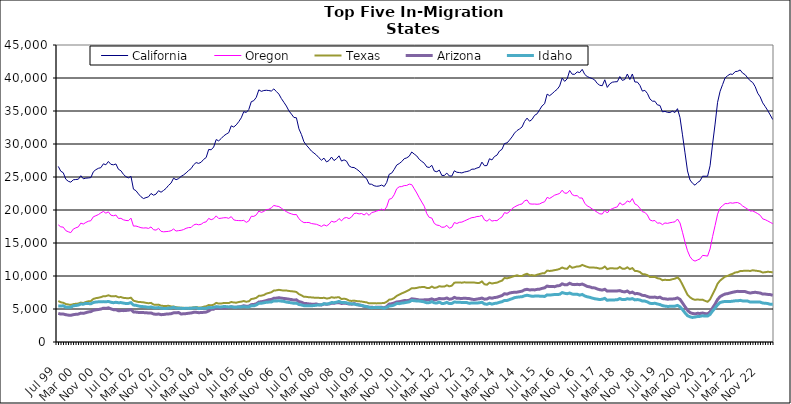
| Category | California | Oregon | Texas | Arizona | Idaho |
|---|---|---|---|---|---|
| Jul 99 | 26605 | 17749 | 6209 | 4339 | 5471 |
| Aug 99 | 25882 | 17447 | 6022 | 4228 | 5444 |
| Sep 99 | 25644 | 17401 | 5941 | 4237 | 5488 |
| Oct 99 | 24669 | 16875 | 5751 | 4134 | 5279 |
| Nov 99 | 24353 | 16701 | 5680 | 4073 | 5260 |
| Dec 99 | 24218 | 16570 | 5619 | 4042 | 5269 |
| Jan 00 | 24574 | 17109 | 5736 | 4142 | 5485 |
| Feb 00 | 24620 | 17295 | 5789 | 4192 | 5530 |
| Mar 00 | 24655 | 17436 | 5826 | 4226 | 5590 |
| Apr 00 | 25195 | 18009 | 5980 | 4375 | 5748 |
| May 00 | 24730 | 17875 | 5897 | 4337 | 5729 |
| Jun 00 | 24825 | 18113 | 6070 | 4444 | 5853 |
| Jul 00 | 24857 | 18294 | 6163 | 4555 | 5824 |
| Aug 00 | 24913 | 18376 | 6199 | 4603 | 5788 |
| Sep 00 | 25792 | 18971 | 6529 | 4804 | 5976 |
| Oct 00 | 26106 | 19135 | 6643 | 4870 | 6058 |
| Nov 00 | 26315 | 19306 | 6705 | 4926 | 6085 |
| Dec 00 | 26415 | 19570 | 6793 | 4991 | 6096 |
| Jan 01 | 26995 | 19781 | 6942 | 5122 | 6119 |
| Feb 01 | 26851 | 19519 | 6948 | 5089 | 6090 |
| Mar 01 | 27352 | 19720 | 7080 | 5180 | 6143 |
| Apr 01 | 26918 | 19221 | 6943 | 5020 | 6020 |
| May 01 | 26848 | 19126 | 6924 | 4899 | 5950 |
| Jun 01 | 26974 | 19241 | 6959 | 4895 | 6019 |
| Jul 01 | 26172 | 18725 | 6778 | 4737 | 5951 |
| Aug 01 | 25943 | 18736 | 6810 | 4757 | 5973 |
| Sep 01 | 25399 | 18514 | 6688 | 4753 | 5895 |
| Oct 01 | 25050 | 18415 | 6650 | 4780 | 5833 |
| Nov 01 | 24873 | 18381 | 6631 | 4826 | 5850 |
| Dec 01 | 25099 | 18765 | 6708 | 4898 | 5969 |
| Jan 02 | 23158 | 17561 | 6261 | 4560 | 5595 |
| Feb 02 | 22926 | 17573 | 6162 | 4531 | 5560 |
| Mar 02 | 22433 | 17452 | 6052 | 4481 | 5458 |
| Apr 02 | 22012 | 17314 | 6046 | 4458 | 5380 |
| May 02 | 21733 | 17267 | 6007 | 4452 | 5358 |
| Jun 02 | 21876 | 17298 | 5933 | 4444 | 5315 |
| Jul 02 | 21997 | 17209 | 5873 | 4383 | 5243 |
| Aug 02 | 22507 | 17436 | 5929 | 4407 | 5315 |
| Sep 02 | 22244 | 17010 | 5672 | 4248 | 5192 |
| Oct 02 | 22406 | 16952 | 5625 | 4191 | 5167 |
| Nov 02 | 22922 | 17223 | 5663 | 4242 | 5221 |
| Dec 02 | 22693 | 16770 | 5499 | 4142 | 5120 |
| Jan 03 | 22964 | 16694 | 5463 | 4166 | 5089 |
| Feb 03 | 23276 | 16727 | 5461 | 4226 | 5077 |
| Mar 03 | 23736 | 16766 | 5486 | 4251 | 5145 |
| Apr 03 | 24079 | 16859 | 5389 | 4289 | 5145 |
| May 03 | 24821 | 17117 | 5378 | 4415 | 5254 |
| Jun 03 | 24592 | 16812 | 5273 | 4426 | 5135 |
| Jul 03 | 24754 | 16875 | 5226 | 4466 | 5124 |
| Aug 03 | 25092 | 16922 | 5181 | 4244 | 5100 |
| Sep 03 | 25316 | 17036 | 5181 | 4279 | 5086 |
| Oct 03 | 25622 | 17228 | 5139 | 4301 | 5110 |
| Nov 03 | 25984 | 17335 | 5175 | 4362 | 5091 |
| Dec 03 | 26269 | 17350 | 5189 | 4396 | 5113 |
| Jan 04 | 26852 | 17734 | 5255 | 4492 | 5152 |
| Feb 04 | 27184 | 17860 | 5301 | 4502 | 5183 |
| Mar 04 | 27062 | 17757 | 5227 | 4443 | 5056 |
| Apr 04 | 27238 | 17840 | 5227 | 4461 | 5104 |
| May 04 | 27671 | 18113 | 5345 | 4493 | 5095 |
| Jun 04 | 27949 | 18201 | 5416 | 4532 | 5103 |
| Jul 04 | 29172 | 18727 | 5597 | 4697 | 5231 |
| Aug 04 | 29122 | 18529 | 5561 | 4945 | 5197 |
| Sep 04 | 29542 | 18678 | 5656 | 4976 | 5237 |
| Oct 04 | 30674 | 19108 | 5922 | 5188 | 5363 |
| Nov 04 | 30472 | 18716 | 5823 | 5106 | 5321 |
| Dec 04 | 30831 | 18755 | 5838 | 5135 | 5312 |
| Jan 05 | 31224 | 18823 | 5906 | 5155 | 5374 |
| Feb 05 | 31495 | 18842 | 5898 | 5168 | 5357 |
| Mar 05 | 31714 | 18738 | 5894 | 5212 | 5313 |
| Apr 05 | 32750 | 18998 | 6060 | 5340 | 5350 |
| May 05 | 32575 | 18504 | 5989 | 5269 | 5276 |
| Jun 05 | 32898 | 18414 | 5954 | 5252 | 5271 |
| Jul 05 | 33384 | 18395 | 6062 | 5322 | 5322 |
| Aug 05 | 33964 | 18381 | 6113 | 5375 | 5316 |
| Sep 05 | 34897 | 18426 | 6206 | 5493 | 5362 |
| Oct 05 | 34780 | 18132 | 6100 | 5408 | 5308 |
| Nov 05 | 35223 | 18332 | 6162 | 5434 | 5314 |
| Dec 05 | 36415 | 19047 | 6508 | 5658 | 5487 |
| Jan 06 | 36567 | 19032 | 6576 | 5688 | 5480 |
| Feb 06 | 37074 | 19257 | 6692 | 5792 | 5616 |
| Mar 06 | 38207 | 19845 | 6993 | 6052 | 5850 |
| Apr 06 | 37976 | 19637 | 7024 | 6101 | 5864 |
| May 06 | 38099 | 19781 | 7114 | 6178 | 5943 |
| Jun 06 | 38141 | 20061 | 7331 | 6276 | 6018 |
| Jul 06 | 38097 | 20111 | 7431 | 6399 | 6046 |
| Aug 06 | 38021 | 20333 | 7542 | 6450 | 6064 |
| Sep 06 | 38349 | 20686 | 7798 | 6627 | 6232 |
| Oct 06 | 37947 | 20591 | 7825 | 6647 | 6216 |
| Nov 06 | 37565 | 20526 | 7907 | 6707 | 6244 |
| Dec 06 | 36884 | 20272 | 7840 | 6648 | 6192 |
| Jan 07 | 36321 | 19984 | 7789 | 6597 | 6151 |
| Feb 07 | 35752 | 19752 | 7799 | 6554 | 6048 |
| Mar 07 | 35025 | 19547 | 7737 | 6487 | 5989 |
| Apr 07 | 34534 | 19412 | 7685 | 6430 | 5937 |
| May 07 | 34022 | 19296 | 7654 | 6353 | 5858 |
| Jun 07 | 33974 | 19318 | 7577 | 6390 | 5886 |
| Jul 07 | 32298 | 18677 | 7250 | 6117 | 5682 |
| Aug 07 | 31436 | 18322 | 7070 | 6034 | 5617 |
| Sep 07 | 30331 | 18087 | 6853 | 5847 | 5500 |
| Oct 07 | 29813 | 18108 | 6839 | 5821 | 5489 |
| Nov 07 | 29384 | 18105 | 6777 | 5769 | 5481 |
| Dec 07 | 28923 | 17949 | 6760 | 5733 | 5499 |
| Jan 08 | 28627 | 17890 | 6721 | 5732 | 5521 |
| Feb 08 | 28328 | 17834 | 6719 | 5749 | 5579 |
| Mar 08 | 27911 | 17680 | 6690 | 5650 | 5614 |
| Apr 08 | 27543 | 17512 | 6656 | 5612 | 5635 |
| May 08 | 27856 | 17754 | 6705 | 5774 | 5798 |
| Jun 08 | 27287 | 17589 | 6593 | 5717 | 5745 |
| Jul 08 | 27495 | 17834 | 6623 | 5761 | 5807 |
| Aug 08 | 28018 | 18309 | 6789 | 5867 | 5982 |
| Sep-08 | 27491 | 18164 | 6708 | 5864 | 5954 |
| Oct 08 | 27771 | 18291 | 6755 | 5942 | 6032 |
| Nov 08 | 28206 | 18706 | 6787 | 5970 | 6150 |
| Dec 08 | 27408 | 18353 | 6505 | 5832 | 5975 |
| Jan 09 | 27601 | 18778 | 6569 | 5890 | 5995 |
| Feb 09 | 27394 | 18863 | 6483 | 5845 | 5936 |
| Mar 09 | 26690 | 18694 | 6273 | 5751 | 5806 |
| Apr 09 | 26461 | 18943 | 6222 | 5735 | 5777 |
| May 09 | 26435 | 19470 | 6272 | 5819 | 5767 |
| Jun 09 | 26187 | 19522 | 6199 | 5700 | 5649 |
| Jul 09 | 25906 | 19408 | 6171 | 5603 | 5617 |
| Aug 09 | 25525 | 19469 | 6128 | 5533 | 5540 |
| Sep 09 | 25050 | 19249 | 6059 | 5405 | 5437 |
| Oct 09 | 24741 | 19529 | 6004 | 5349 | 5369 |
| Nov 09 | 23928 | 19187 | 5854 | 5271 | 5248 |
| Dec 09 | 23899 | 19607 | 5886 | 5261 | 5195 |
| Jan 10 | 23676 | 19703 | 5881 | 5232 | 5234 |
| Feb 10 | 23592 | 19845 | 5850 | 5272 | 5236 |
| Mar 10 | 23634 | 19946 | 5864 | 5278 | 5219 |
| Apr 10 | 23774 | 20134 | 5889 | 5257 | 5201 |
| May 10 | 23567 | 19966 | 5897 | 5172 | 5105 |
| Jun 10 | 24166 | 20464 | 6087 | 5356 | 5237 |
| Jul 10 | 25410 | 21627 | 6417 | 5742 | 5452 |
| Aug 10 | 25586 | 21744 | 6465 | 5797 | 5491 |
| Sep 10 | 26150 | 22314 | 6667 | 5907 | 5609 |
| Oct 10 | 26807 | 23219 | 6986 | 6070 | 5831 |
| Nov 10 | 27033 | 23520 | 7179 | 6100 | 5810 |
| Dec 10 | 27332 | 23551 | 7361 | 6182 | 5898 |
| Jan 11 | 27769 | 23697 | 7525 | 6276 | 5938 |
| Feb 11 | 27898 | 23718 | 7708 | 6267 | 6016 |
| Mar 11 | 28155 | 23921 | 7890 | 6330 | 6081 |
| Apr 11 | 28790 | 23847 | 8146 | 6544 | 6305 |
| May 11 | 28471 | 23215 | 8131 | 6502 | 6248 |
| Jun 11 | 28191 | 22580 | 8199 | 6445 | 6217 |
| Jul 11 | 27678 | 21867 | 8291 | 6368 | 6202 |
| Aug 11 | 27372 | 21203 | 8321 | 6356 | 6146 |
| Sep 11 | 27082 | 20570 | 8341 | 6387 | 6075 |
| Oct 11 | 26528 | 19442 | 8191 | 6402 | 5932 |
| Nov 11 | 26440 | 18872 | 8176 | 6426 | 5968 |
| Dec 11 | 26770 | 18784 | 8401 | 6533 | 6106 |
| Jan 12 | 25901 | 17963 | 8202 | 6390 | 5933 |
| Feb 12 | 25796 | 17718 | 8266 | 6456 | 5900 |
| Mar 12 | 26042 | 17647 | 8456 | 6600 | 6054 |
| Apr 12 | 25239 | 17386 | 8388 | 6534 | 5838 |
| May 12 | 25238 | 17407 | 8401 | 6558 | 5854 |
| Jun 12 | 25593 | 17673 | 8594 | 6669 | 6009 |
| Jul 12 | 25155 | 17237 | 8432 | 6474 | 5817 |
| Aug 12 | 25146 | 17391 | 8536 | 6539 | 5842 |
| Sep 12 | 25942 | 18102 | 8989 | 6759 | 6061 |
| Oct 12 | 25718 | 17953 | 9012 | 6618 | 6027 |
| Nov 12 | 25677 | 18134 | 9032 | 6611 | 6009 |
| Dec 12 | 25619 | 18166 | 8981 | 6601 | 5999 |
| Jan 13 | 25757 | 18344 | 9051 | 6627 | 5989 |
| Feb-13 | 25830 | 18512 | 9001 | 6606 | 5968 |
| Mar-13 | 25940 | 18689 | 9021 | 6577 | 5853 |
| Apr 13 | 26187 | 18844 | 9013 | 6478 | 5925 |
| May 13 | 26192 | 18884 | 9003 | 6431 | 5924 |
| Jun-13 | 26362 | 19013 | 8948 | 6508 | 5896 |
| Jul 13 | 26467 | 19037 | 8958 | 6559 | 5948 |
| Aug 13 | 27253 | 19198 | 9174 | 6655 | 6020 |
| Sep 13 | 26711 | 18501 | 8747 | 6489 | 5775 |
| Oct 13 | 26733 | 18301 | 8681 | 6511 | 5711 |
| Nov 13 | 27767 | 18620 | 8989 | 6709 | 5860 |
| Dec 13 | 27583 | 18320 | 8863 | 6637 | 5740 |
| Jan 14 | 28107 | 18409 | 8939 | 6735 | 5843 |
| Feb-14 | 28313 | 18383 | 8989 | 6779 | 5893 |
| Mar 14 | 28934 | 18696 | 9160 | 6918 | 6015 |
| Apr 14 | 29192 | 18946 | 9291 | 7036 | 6099 |
| May 14 | 30069 | 19603 | 9701 | 7314 | 6304 |
| Jun 14 | 30163 | 19487 | 9641 | 7252 | 6293 |
| Jul-14 | 30587 | 19754 | 9752 | 7415 | 6427 |
| Aug-14 | 31074 | 20201 | 9882 | 7499 | 6557 |
| Sep 14 | 31656 | 20459 | 9997 | 7536 | 6719 |
| Oct 14 | 32037 | 20663 | 10109 | 7555 | 6786 |
| Nov 14 | 32278 | 20825 | 9992 | 7628 | 6831 |
| Dec 14 | 32578 | 20918 | 10006 | 7705 | 6860 |
| Jan 15 | 33414 | 21396 | 10213 | 7906 | 7000 |
| Feb 15 | 33922 | 21518 | 10337 | 7982 | 7083 |
| Mar 15 | 33447 | 20942 | 10122 | 7891 | 7006 |
| Apr-15 | 33731 | 20893 | 10138 | 7906 | 6931 |
| May 15 | 34343 | 20902 | 10053 | 7895 | 6952 |
| Jun-15 | 34572 | 20870 | 10192 | 7973 | 6966 |
| Jul 15 | 35185 | 20916 | 10303 | 8000 | 6949 |
| Aug 15 | 35780 | 21115 | 10399 | 8126 | 6938 |
| Sep 15 | 36109 | 21246 | 10428 | 8207 | 6896 |
| Oct 15 | 37555 | 21908 | 10813 | 8477 | 7140 |
| Nov 15 | 37319 | 21750 | 10763 | 8390 | 7112 |
| Dec 15 | 37624 | 21990 | 10807 | 8395 | 7149 |
| Jan 16 | 37978 | 22248 | 10892 | 8388 | 7201 |
| Feb 16 | 38285 | 22369 | 10951 | 8508 | 7192 |
| Mar 16 | 38792 | 22506 | 11075 | 8547 | 7226 |
| Apr 16 | 39994 | 22999 | 11286 | 8815 | 7487 |
| May 16 | 39488 | 22548 | 11132 | 8673 | 7382 |
| Jun 16 | 39864 | 22556 | 11100 | 8682 | 7315 |
| Jul 16 | 41123 | 22989 | 11516 | 8903 | 7420 |
| Aug 16 | 40573 | 22333 | 11251 | 8731 | 7261 |
| Sep 16 | 40560 | 22162 | 11340 | 8692 | 7216 |
| Oct 16 | 40923 | 22172 | 11456 | 8742 | 7233 |
| Nov 16 | 40817 | 21818 | 11459 | 8685 | 7101 |
| Dec 16 | 41311 | 21815 | 11681 | 8783 | 7203 |
| Jan 17 | 40543 | 21029 | 11524 | 8609 | 6982 |
| Feb 17 | 40218 | 20613 | 11385 | 8416 | 6852 |
| Mar 17 | 40052 | 20425 | 11276 | 8354 | 6775 |
| Apr 17 | 39913 | 20147 | 11297 | 8218 | 6653 |
| May 17 | 39695 | 19910 | 11265 | 8196 | 6552 |
| Jun 17 | 39177 | 19650 | 11225 | 8034 | 6500 |
| Jul 17 | 38901 | 19419 | 11115 | 7923 | 6429 |
| Aug 17 | 38827 | 19389 | 11168 | 7867 | 6479 |
| Sep 17 | 39736 | 19936 | 11426 | 7991 | 6609 |
| Oct 17 | 38576 | 19547 | 11041 | 7708 | 6315 |
| Nov 17 | 39108 | 20013 | 11158 | 7746 | 6381 |
| Dec 17 | 39359 | 20202 | 11185 | 7743 | 6366 |
| Jan 18 | 39420 | 20362 | 11118 | 7736 | 6380 |
| Feb 18 | 39440 | 20476 | 11128 | 7741 | 6407 |
| Mar 18 | 40218 | 21106 | 11362 | 7789 | 6578 |
| Apr 18 | 39637 | 20788 | 11111 | 7642 | 6423 |
| May 18 | 39777 | 20933 | 11097 | 7591 | 6430 |
| Jun 18 | 40602 | 21381 | 11317 | 7721 | 6554 |
| Jul 18 | 39767 | 21189 | 11038 | 7445 | 6489 |
| Aug 18 | 40608 | 21729 | 11200 | 7560 | 6569 |
| Sep 18 | 39395 | 20916 | 10772 | 7318 | 6383 |
| Oct 18 | 39383 | 20724 | 10740 | 7344 | 6429 |
| Nov 18 | 38891 | 20265 | 10605 | 7255 | 6365 |
| Dec 18 | 38013 | 19741 | 10292 | 7069 | 6205 |
| Jan 19 | 38130 | 19643 | 10261 | 7032 | 6203 |
| Feb 19 | 37658 | 19237 | 10132 | 6892 | 6073 |
| Mar 19 | 36831 | 18492 | 9848 | 6766 | 5863 |
| Apr 19 | 36492 | 18349 | 9839 | 6763 | 5827 |
| May 19 | 36481 | 18407 | 9867 | 6809 | 5873 |
| Jun 19 | 35925 | 17998 | 9661 | 6698 | 5761 |
| Jul 19 | 35843 | 18049 | 9598 | 6800 | 5673 |
| Aug 19 | 34870 | 17785 | 9361 | 6577 | 5512 |
| Sep 19 | 34945 | 18038 | 9428 | 6547 | 5437 |
| Oct 19 | 34802 | 17977 | 9385 | 6483 | 5390 |
| Nov 19 | 34775 | 18072 | 9403 | 6511 | 5401 |
| Dec 19 | 34976 | 18140 | 9518 | 6521 | 5419 |
| Jan 20 | 34774 | 18209 | 9594 | 6561 | 5434 |
| Feb 20 | 35352 | 18632 | 9804 | 6682 | 5543 |
| Mar 20 | 34013 | 18041 | 9411 | 6464 | 5330 |
| Apr 20 | 31385 | 16629 | 8666 | 5922 | 4906 |
| May 20 | 28657 | 15123 | 7927 | 5355 | 4419 |
| Jun 20 | 25915 | 13817 | 7164 | 4815 | 3992 |
| Jul 20 | 24545 | 12926 | 6776 | 4457 | 3810 |
| Aug 20 | 24048 | 12443 | 6521 | 4326 | 3720 |
| Sep 20 | 23756 | 12258 | 6386 | 4266 | 3784 |
| Oct 20 | 24166 | 12429 | 6452 | 4347 | 3861 |
| Nov 20 | 24404 | 12597 | 6386 | 4324 | 3883 |
| Dec 20 | 25120 | 13122 | 6420 | 4394 | 3974 |
| Jan 21 | 25111 | 13080 | 6236 | 4304 | 3924 |
| Feb 21 | 25114 | 13015 | 6094 | 4260 | 3930 |
| Mar 21 | 26701 | 14096 | 6455 | 4567 | 4185 |
| Apr 21 | 29998 | 15978 | 7222 | 5164 | 4697 |
| May 21 | 33020 | 17641 | 7969 | 5748 | 5148 |
| Jun 21 | 36320 | 19369 | 8840 | 6450 | 5628 |
| Jul 21 | 37989 | 20320 | 9306 | 6877 | 5984 |
| Aug 21 | 39007 | 20657 | 9615 | 7094 | 6084 |
| Sep 21 | 40023 | 20974 | 9914 | 7277 | 6151 |
| Oct 21 | 40348 | 20966 | 10003 | 7327 | 6140 |
| Nov 21 | 40599 | 21096 | 10203 | 7437 | 6136 |
| Dec 21 | 40548 | 21032 | 10328 | 7532 | 6183 |
| Jan 22 | 40967 | 21106 | 10535 | 7618 | 6237 |
| Feb 22 | 41019 | 21125 | 10579 | 7673 | 6236 |
| Mar 22 | 41220 | 20949 | 10751 | 7660 | 6310 |
| Apr 22 | 40730 | 20602 | 10772 | 7661 | 6221 |
| May 22 | 40504 | 20370 | 10792 | 7636 | 6210 |
| Jun 22 | 40013 | 20127 | 10802 | 7504 | 6199 |
| Jul 22 | 39582 | 19846 | 10761 | 7419 | 6050 |
| Aug 22 | 39321 | 19865 | 10868 | 7487 | 6071 |
| Sep 22 | 38685 | 19666 | 10811 | 7536 | 6074 |
| Oct 22 | 37700 | 19450 | 10764 | 7469 | 6042 |
| Nov 22 | 37133 | 19198 | 10701 | 7425 | 6042 |
| Dec 22 | 36232 | 18659 | 10527 | 7261 | 5898 |
| Jan 23 | 35674 | 18528 | 10578 | 7263 | 5879 |
| Feb 23 | 35072 | 18344 | 10642 | 7211 | 5827 |
| Mar 23 | 34396 | 18133 | 10609 | 7183 | 5713 |
| Apr 23 | 33708 | 17931 | 10559 | 7074 | 5706 |